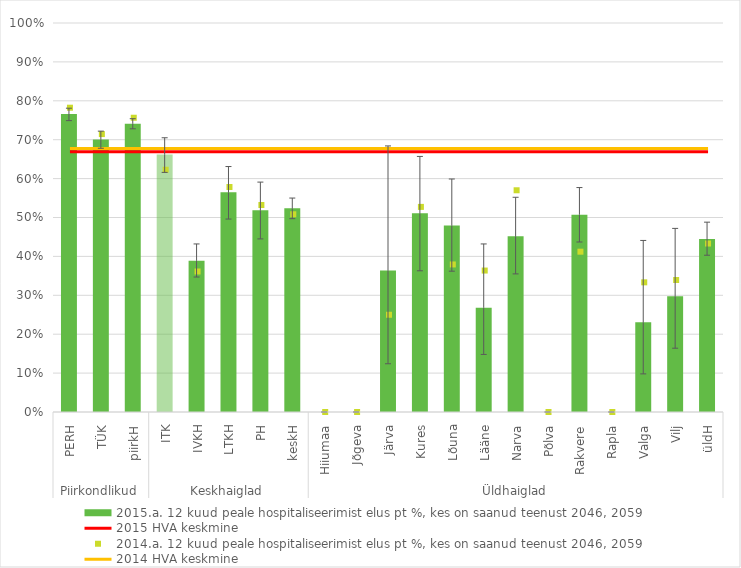
| Category | 2015.a. 12 kuud peale hospitaliseerimist elus pt %, kes on saanud teenust 2046, 2059 |
|---|---|
| 0 | 0.766 |
| 1 | 0.701 |
| 2 | 0.741 |
| 3 | 0.662 |
| 4 | 0.389 |
| 5 | 0.565 |
| 6 | 0.518 |
| 7 | 0.524 |
| 8 | 0 |
| 9 | 0 |
| 10 | 0.364 |
| 11 | 0.511 |
| 12 | 0.479 |
| 13 | 0.268 |
| 14 | 0.452 |
| 15 | 0 |
| 16 | 0.507 |
| 17 | 0 |
| 18 | 0.231 |
| 19 | 0.297 |
| 20 | 0.445 |